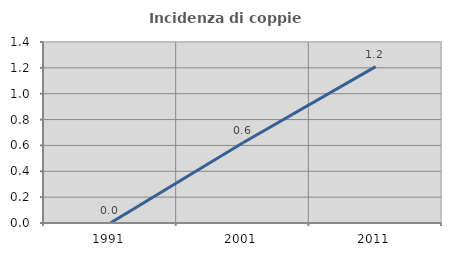
| Category | Incidenza di coppie miste |
|---|---|
| 1991.0 | 0 |
| 2001.0 | 0.621 |
| 2011.0 | 1.209 |